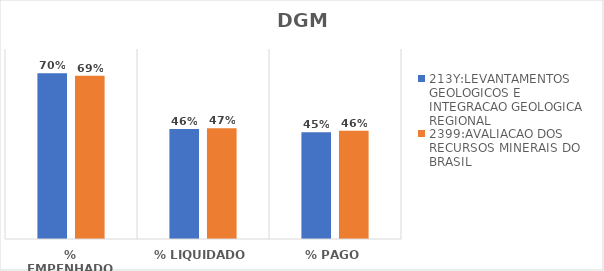
| Category | 213Y:LEVANTAMENTOS GEOLOGICOS E INTEGRACAO GEOLOGICA REGIONAL | 2399:AVALIACAO DOS RECURSOS MINERAIS DO BRASIL |
|---|---|---|
| % EMPENHADO | 0.697 | 0.688 |
| % LIQUIDADO | 0.464 | 0.466 |
| % PAGO | 0.45 | 0.455 |